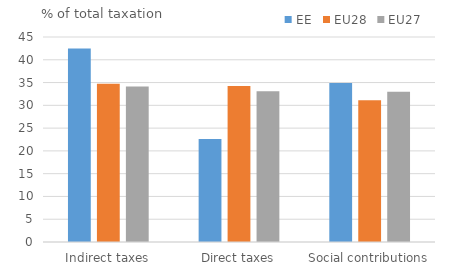
| Category | EE | EU28 | EU27 |
|---|---|---|---|
| Indirect taxes | 42.482 | 34.748 | 34.122 |
| Direct taxes | 22.61 | 34.27 | 33.09 |
| Social contributions | 34.909 | 31.135 | 32.964 |